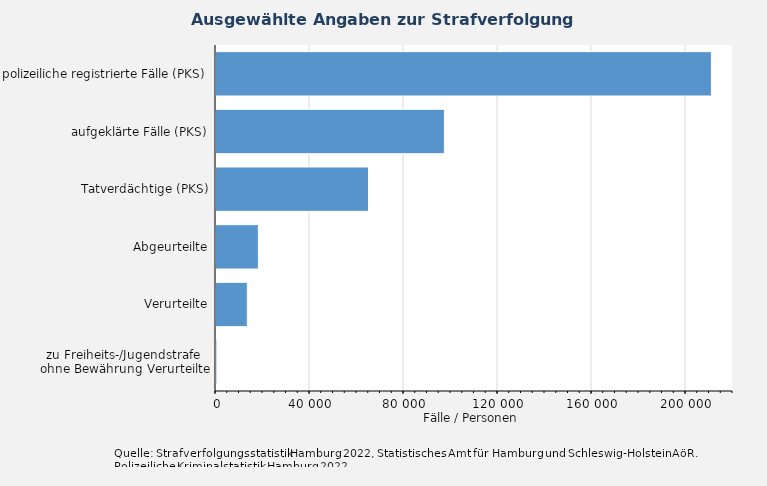
| Category | Fälle / Personen |
|---|---|
| polizeiliche registrierte Fälle (PKS) | 211239 |
| aufgeklärte Fälle (PKS) | 97620 |
| Tatverdächtige (PKS) | 65319 |
| Abgeurteilte | 18461 |
| Verurteilte | 13762 |
| zu Freiheits-/Jugendstrafe 
ohne Bewährung Verurteilte | 800 |